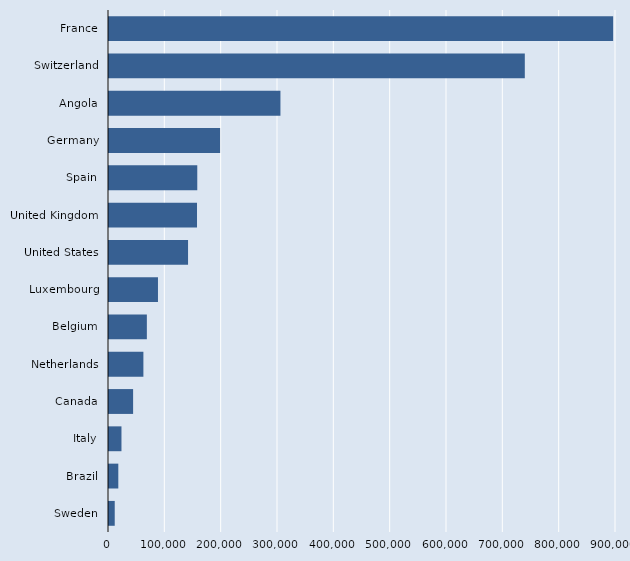
| Category | Series 2 |
|---|---|
| France | 894932 |
| Switzerland | 738128 |
| Angola | 304328 |
| Germany | 197247 |
| Spain | 156697 |
| United Kingdom | 156227 |
| United States | 140320 |
| Luxembourg | 86937 |
| Belgium | 67205 |
| Netherlands | 61053 |
| Canada | 42792 |
| Italy | 22136 |
| Brazil | 16524 |
| Sweden | 10175 |